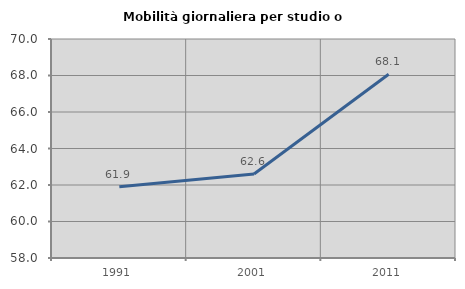
| Category | Mobilità giornaliera per studio o lavoro |
|---|---|
| 1991.0 | 61.906 |
| 2001.0 | 62.6 |
| 2011.0 | 68.072 |